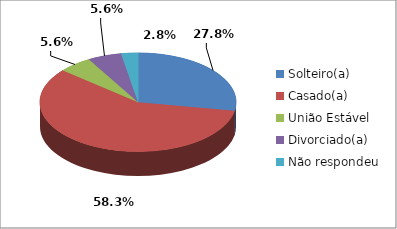
| Category | Series 0 |
|---|---|
| Solteiro(a) | 10 |
| Casado(a) | 21 |
| União Estável | 2 |
| Divorciado(a) | 2 |
| Não respondeu | 1 |